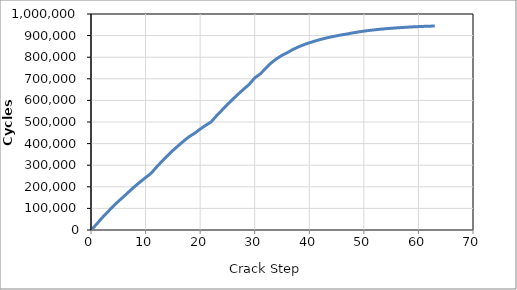
| Category | Series 0 |
|---|---|
| 0.0 | 0 |
| 1.0 | 26012.55 |
| 2.0 | 55534.31 |
| 3.0 | 81782.205 |
| 4.0 | 108126.927 |
| 5.0 | 132466.054 |
| 6.0 | 154861.7 |
| 7.0 | 178417.349 |
| 8.0 | 201290.318 |
| 9.0 | 222457.232 |
| 10.0 | 242745.168 |
| 11.0 | 262159.235 |
| 12.0 | 291049.32 |
| 13.0 | 318126.794 |
| 14.0 | 343761.194 |
| 15.0 | 368113.612 |
| 16.0 | 390320.327 |
| 17.0 | 412346.095 |
| 18.0 | 432218.451 |
| 19.0 | 448110.038 |
| 20.0 | 467069.965 |
| 21.0 | 484347.529 |
| 22.0 | 500178.747 |
| 23.0 | 528535.987 |
| 24.0 | 554863.697 |
| 25.0 | 581308.586 |
| 26.0 | 605787.479 |
| 27.0 | 629718.461 |
| 28.0 | 652650.472 |
| 29.0 | 674414.818 |
| 30.0 | 704175.759 |
| 31.0 | 722334.03 |
| 32.0 | 747801.363 |
| 33.0 | 773169.673 |
| 34.0 | 792737.314 |
| 35.0 | 808467.734 |
| 36.0 | 821492.411 |
| 37.0 | 835738.256 |
| 38.0 | 847533.562 |
| 39.0 | 857689.635 |
| 40.0 | 866595.589 |
| 41.0 | 874501.869 |
| 42.0 | 881825.849 |
| 43.0 | 888161.034 |
| 44.0 | 893838.234 |
| 45.0 | 899004.721 |
| 46.0 | 903706.521 |
| 47.0 | 907947.83 |
| 48.0 | 912705.732 |
| 49.0 | 916901.924 |
| 50.0 | 920653.368 |
| 51.0 | 923969.379 |
| 52.0 | 926909.814 |
| 53.0 | 929524.679 |
| 54.0 | 931855.907 |
| 55.0 | 933930.244 |
| 56.0 | 935778.623 |
| 57.0 | 937391.723 |
| 58.0 | 939047.135 |
| 59.0 | 940467.413 |
| 60.0 | 941683.484 |
| 61.0 | 942717.339 |
| 62.0 | 943593.649 |
| 63.0 | 944330.224 |